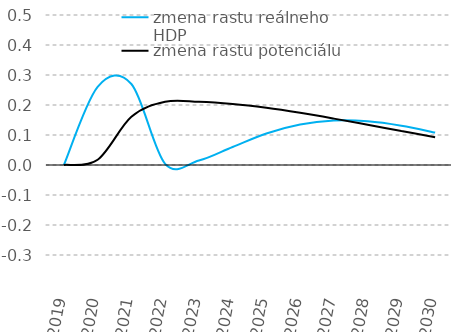
| Category | zmena rastu reálneho HDP | zmena rastu potenciálu  |
|---|---|---|
| 2019.0 | 0 | 0 |
| 2020.0 | 0.26 | 0.018 |
| 2021.0 | 0.27 | 0.161 |
| 2022.0 | 0.004 | 0.211 |
| 2023.0 | 0.015 | 0.21 |
| 2024.0 | 0.06 | 0.203 |
| 2025.0 | 0.105 | 0.191 |
| 2026.0 | 0.135 | 0.174 |
| 2027.0 | 0.148 | 0.155 |
| 2028.0 | 0.146 | 0.134 |
| 2029.0 | 0.131 | 0.113 |
| 2030.0 | 0.108 | 0.093 |